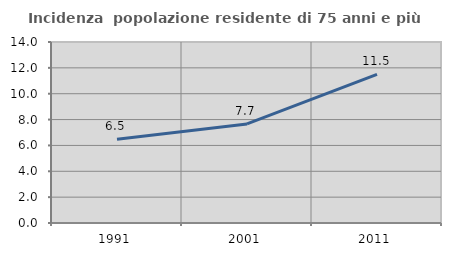
| Category | Incidenza  popolazione residente di 75 anni e più |
|---|---|
| 1991.0 | 6.473 |
| 2001.0 | 7.661 |
| 2011.0 | 11.491 |